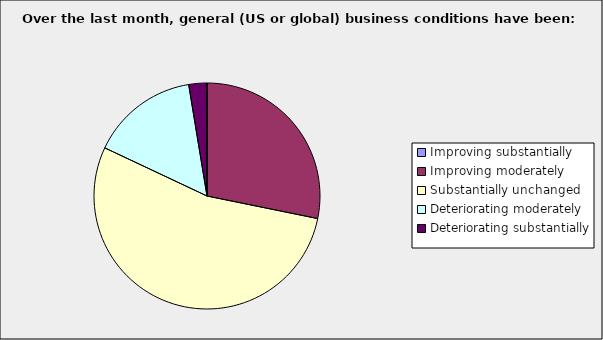
| Category | Series 0 |
|---|---|
| Improving substantially | 0 |
| Improving moderately | 0.282 |
| Substantially unchanged | 0.538 |
| Deteriorating moderately | 0.154 |
| Deteriorating substantially | 0.026 |